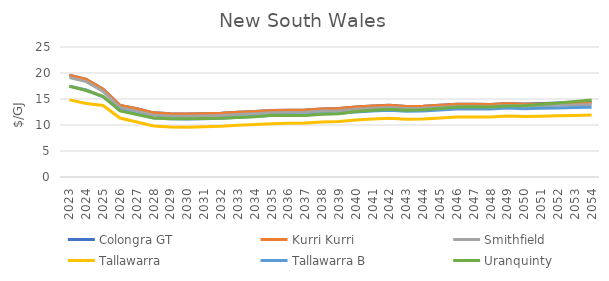
| Category | Colongra GT | Kurri Kurri | Smithfield | Tallawarra | Tallawarra B | Uranquinty |
|---|---|---|---|---|---|---|
| 2023.0 | 19.567 | 19.567 | 19.135 | 14.832 | 17.48 | 17.46 |
| 2024.0 | 18.773 | 18.773 | 18.343 | 14.129 | 16.723 | 16.641 |
| 2025.0 | 16.899 | 16.899 | 16.471 | 13.757 | 15.427 | 15.523 |
| 2026.0 | 13.767 | 13.767 | 13.342 | 11.342 | 12.842 | 12.706 |
| 2027.0 | 13.108 | 13.108 | 12.663 | 10.563 | 12.138 | 12.034 |
| 2028.0 | 12.336 | 12.336 | 11.893 | 9.793 | 11.368 | 11.358 |
| 2029.0 | 12.165 | 12.165 | 11.724 | 9.624 | 11.199 | 11.21 |
| 2030.0 | 12.108 | 12.108 | 11.67 | 9.57 | 11.145 | 11.217 |
| 2031.0 | 12.177 | 12.177 | 11.741 | 9.641 | 11.216 | 11.241 |
| 2032.0 | 12.278 | 12.278 | 11.844 | 9.744 | 11.319 | 11.28 |
| 2033.0 | 12.46 | 12.46 | 12.028 | 9.928 | 11.503 | 11.44 |
| 2034.0 | 12.604 | 12.604 | 12.174 | 10.074 | 11.649 | 11.575 |
| 2035.0 | 12.789 | 12.789 | 12.361 | 10.261 | 11.836 | 11.851 |
| 2036.0 | 12.851 | 12.851 | 12.425 | 10.325 | 11.9 | 11.818 |
| 2037.0 | 12.886 | 12.886 | 12.463 | 10.363 | 11.938 | 11.844 |
| 2038.0 | 13.092 | 13.092 | 12.671 | 10.571 | 12.146 | 12.068 |
| 2039.0 | 13.173 | 13.173 | 12.754 | 10.654 | 12.229 | 12.184 |
| 2040.0 | 13.465 | 13.465 | 13.048 | 10.948 | 12.523 | 12.583 |
| 2041.0 | 13.651 | 13.651 | 13.236 | 11.136 | 12.711 | 12.856 |
| 2042.0 | 13.795 | 13.795 | 13.381 | 11.281 | 12.856 | 13.026 |
| 2043.0 | 13.574 | 13.574 | 13.173 | 11.123 | 12.66 | 12.847 |
| 2044.0 | 13.603 | 13.603 | 13.203 | 11.153 | 12.691 | 12.911 |
| 2045.0 | 13.812 | 13.812 | 13.415 | 11.365 | 12.902 | 13.188 |
| 2046.0 | 13.966 | 13.966 | 13.571 | 11.521 | 13.058 | 13.439 |
| 2047.0 | 13.984 | 13.984 | 13.598 | 11.548 | 13.085 | 13.494 |
| 2048.0 | 13.951 | 13.951 | 13.574 | 11.524 | 13.062 | 13.475 |
| 2049.0 | 14.134 | 14.134 | 13.766 | 11.716 | 13.254 | 13.666 |
| 2050.0 | 14.034 | 13.991 | 13.635 | 11.615 | 13.13 | 13.724 |
| 2051.0 | 14.142 | 14.055 | 13.706 | 11.686 | 13.201 | 13.986 |
| 2052.0 | 14.25 | 14.12 | 13.777 | 11.757 | 13.272 | 14.254 |
| 2053.0 | 14.36 | 14.185 | 13.848 | 11.829 | 13.343 | 14.526 |
| 2054.0 | 14.47 | 14.25 | 13.92 | 11.901 | 13.415 | 14.804 |